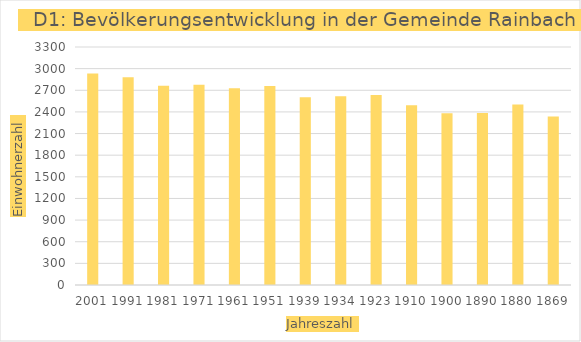
| Category | Einwohnerzahl |
|---|---|
| 2001 | 2934 |
| 1991 | 2881 |
| 1981 | 2763 |
| 1971 | 2776 |
| 1961 | 2729 |
| 1951 | 2759 |
| 1939 | 2602 |
| 1934 | 2617 |
| 1923 | 2634 |
| 1910 | 2491 |
| 1900 | 2381 |
| 1890 | 2386 |
| 1880 | 2501 |
| 1869 | 2335 |